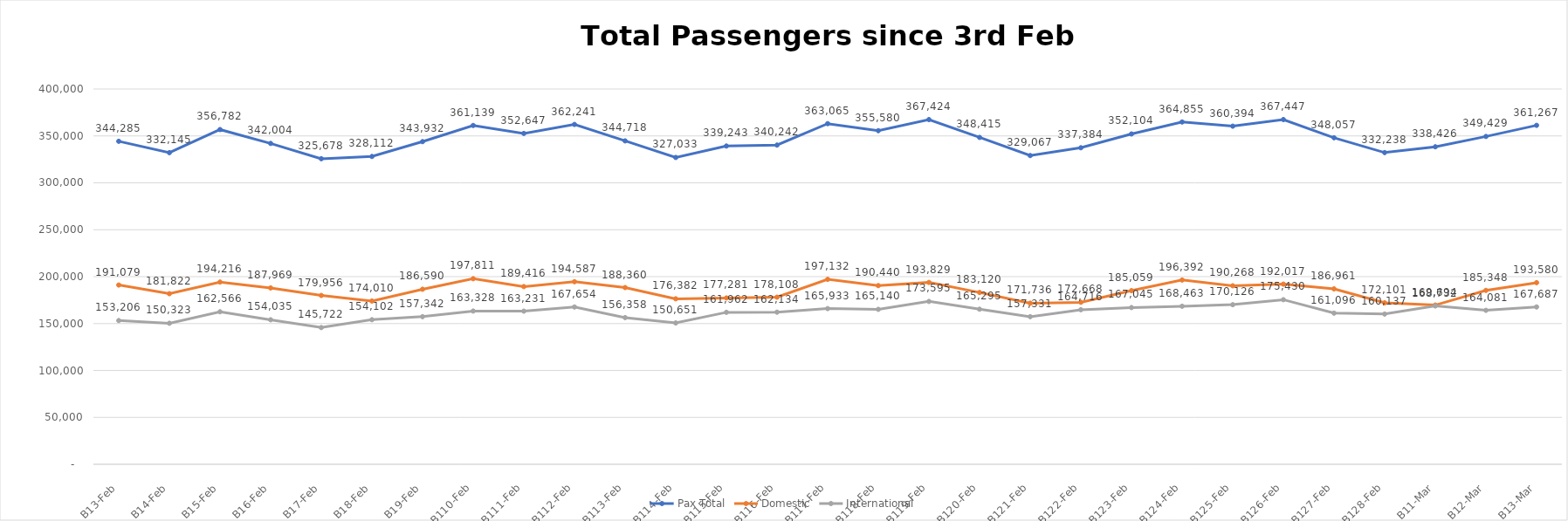
| Category | Pax Total |  Domestic  |  International  |
|---|---|---|---|
| 2023-02-03 | 344285 | 191079 | 153206 |
| 2023-02-04 | 332145 | 181822 | 150323 |
| 2023-02-05 | 356782 | 194216 | 162566 |
| 2023-02-06 | 342004 | 187969 | 154035 |
| 2023-02-07 | 325678 | 179956 | 145722 |
| 2023-02-08 | 328112 | 174010 | 154102 |
| 2023-02-09 | 343932 | 186590 | 157342 |
| 2023-02-10 | 361139 | 197811 | 163328 |
| 2023-02-11 | 352647 | 189416 | 163231 |
| 2023-02-12 | 362241 | 194587 | 167654 |
| 2023-02-13 | 344718 | 188360 | 156358 |
| 2023-02-14 | 327033 | 176382 | 150651 |
| 2023-02-15 | 339243 | 177281 | 161962 |
| 2023-02-16 | 340242 | 178108 | 162134 |
| 2023-02-17 | 363065 | 197132 | 165933 |
| 2023-02-18 | 355580 | 190440 | 165140 |
| 2023-02-19 | 367424 | 193829 | 173595 |
| 2023-02-20 | 348415 | 183120 | 165295 |
| 2023-02-21 | 329067 | 171736 | 157331 |
| 2023-02-22 | 337384 | 172668 | 164716 |
| 2023-02-23 | 352104 | 185059 | 167045 |
| 2023-02-24 | 364855 | 196392 | 168463 |
| 2023-02-25 | 360394 | 190268 | 170126 |
| 2023-02-26 | 367447 | 192017 | 175430 |
| 2023-02-27 | 348057 | 186961 | 161096 |
| 2023-02-28 | 332238 | 172101 | 160137 |
| 2023-03-01 | 338426 | 169694 | 168732 |
| 2023-03-02 | 349429 | 185348 | 164081 |
| 2023-03-03 | 361267 | 193580 | 167687 |